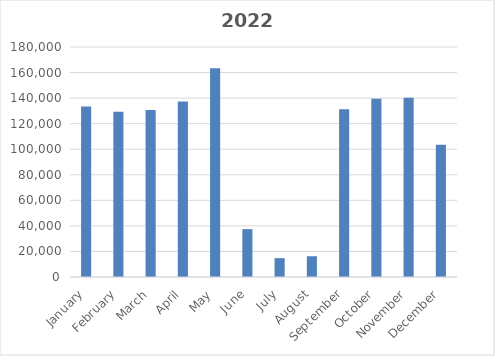
| Category | Series 0 |
|---|---|
| January | 133377 |
| February | 129392 |
| March | 130726 |
| April | 137294 |
| May | 163308 |
| June | 37468 |
| July | 14744 |
| August | 16258 |
| September | 131192 |
| October | 139481 |
| November | 140258 |
| December | 103478 |